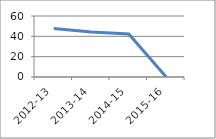
| Category | Series 0 |
|---|---|
| 2012-13 | 47.752 |
| 2013-14 | 44.306 |
| 2014-15 | 42.24 |
| 2015-16 | 0 |